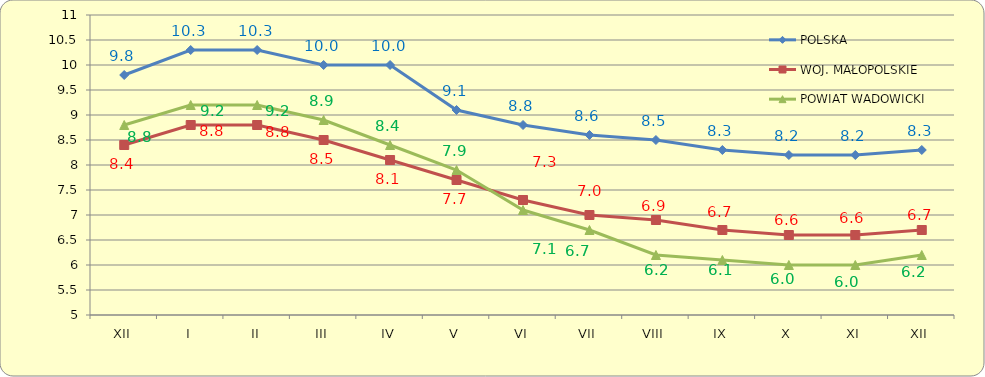
| Category | POLSKA | WOJ. MAŁOPOLSKIE | POWIAT WADOWICKI |
|---|---|---|---|
| XII | 9.8 | 8.4 | 8.8 |
| I | 10.3 | 8.8 | 9.2 |
| II | 10.3 | 8.8 | 9.2 |
| III | 10 | 8.5 | 8.9 |
| IV | 10 | 8.1 | 8.4 |
| V | 9.1 | 7.7 | 7.9 |
| VI | 8.8 | 7.3 | 7.1 |
| VII | 8.6 | 7 | 6.7 |
| VIII | 8.5 | 6.9 | 6.2 |
| IX | 8.3 | 6.7 | 6.1 |
| X | 8.2 | 6.6 | 6 |
| XI | 8.2 | 6.6 | 6 |
| XII | 8.3 | 6.7 | 6.2 |